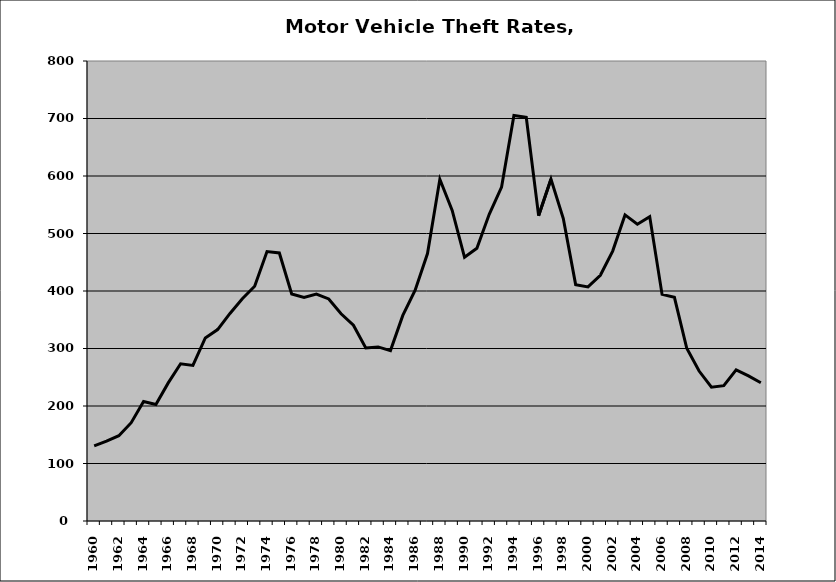
| Category | Motor Vehicle |
|---|---|
| 1960.0 | 130.662 |
| 1961.0 | 138.911 |
| 1962.0 | 148.283 |
| 1963.0 | 171.03 |
| 1964.0 | 207.91 |
| 1965.0 | 202.528 |
| 1966.0 | 240.205 |
| 1967.0 | 273.437 |
| 1968.0 | 270.568 |
| 1969.0 | 318.455 |
| 1970.0 | 332.842 |
| 1971.0 | 360.982 |
| 1972.0 | 386.572 |
| 1973.0 | 408.18 |
| 1974.0 | 468.667 |
| 1975.0 | 466.171 |
| 1976.0 | 394.805 |
| 1977.0 | 388.889 |
| 1978.0 | 394.804 |
| 1979.0 | 386.189 |
| 1980.0 | 360.317 |
| 1981.0 | 340.423 |
| 1982.0 | 300.982 |
| 1983.0 | 302.78 |
| 1984.0 | 296.41 |
| 1985.0 | 357.574 |
| 1986.0 | 401.52 |
| 1987.0 | 465.088 |
| 1988.0 | 594.418 |
| 1989.0 | 540.142 |
| 1990.0 | 458.604 |
| 1991.0 | 474.401 |
| 1992.0 | 533.456 |
| 1993.0 | 580.739 |
| 1994.0 | 705.25 |
| 1995.0 | 702.006 |
| 1996.0 | 530.993 |
| 1997.0 | 594.511 |
| 1998.0 | 525.96 |
| 1999.0 | 411.109 |
| 2000.0 | 407.202 |
| 2001.0 | 427.3 |
| 2002.0 | 469.384 |
| 2003.0 | 532.33 |
| 2004.0 | 516.099 |
| 2005.0 | 529.34 |
| 2006.0 | 394.135 |
| 2007.0 | 388.931 |
| 2008.0 | 300.45 |
| 2009.0 | 260.792 |
| 2010.0 | 232.624 |
| 2011.0 | 235.405 |
| 2012.0 | 262.885 |
| 2013.0 | 252.338 |
| 2014.0 | 240.514 |